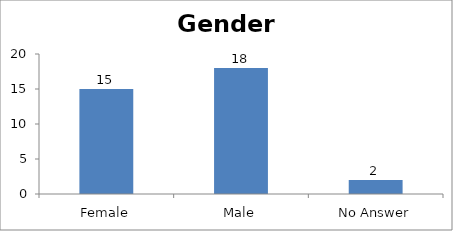
| Category | Gender |
|---|---|
| Female | 15 |
| Male | 18 |
| No Answer | 2 |